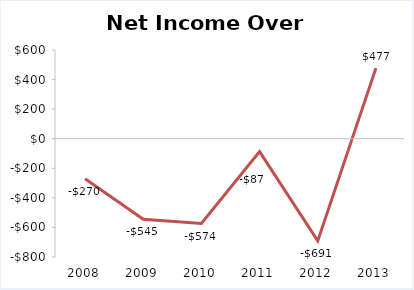
| Category | Net Income |
|---|---|
| 2008.0 | -270.49 |
| 2009.0 | -545.31 |
| 2010.0 | -573.54 |
| 2011.0 | -86.9 |
| 2012.0 | -690.87 |
| 2013.0 | 477.37 |